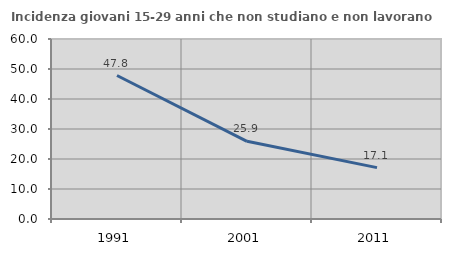
| Category | Incidenza giovani 15-29 anni che non studiano e non lavorano  |
|---|---|
| 1991.0 | 47.826 |
| 2001.0 | 25.895 |
| 2011.0 | 17.135 |